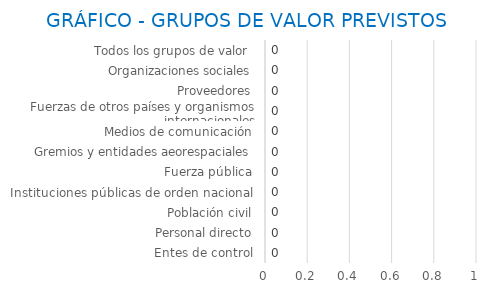
| Category | Series 0 |
|---|---|
| Entes de control | 0 |
| Personal directo | 0 |
| Población civil | 0 |
| Instituciones públicas de orden nacional | 0 |
| Fuerza pública | 0 |
| Gremios y entidades aeorespaciales | 0 |
| Medios de comunicación | 0 |
| Fuerzas de otros países y organismos internacionales | 0 |
| Proveedores | 0 |
| Organizaciones sociales | 0 |
| Todos los grupos de valor  | 0 |